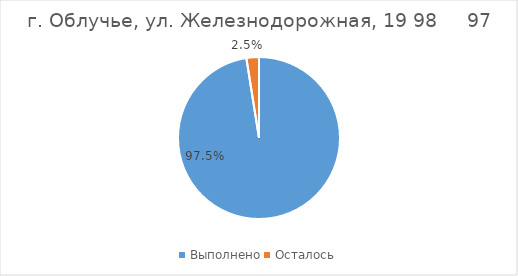
| Category | г. Облучье, ул. Железнодорожная, 19 |
|---|---|
| Выполнено | 0.975 |
| Осталось | 0.025 |